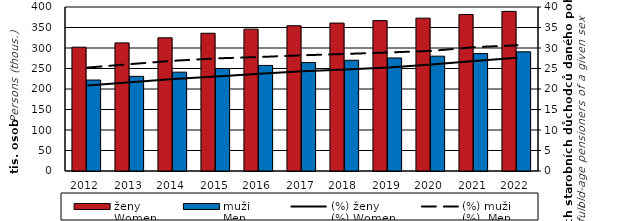
| Category | ženy  
Women | muži  
Men |
|---|---|---|
| 2012.0 | 301986 | 221900 |
| 2013.0 | 312495 | 230861 |
| 2014.0 | 324865 | 241061 |
| 2015.0 | 335915 | 250094 |
| 2016.0 | 346027 | 257474 |
| 2017.0 | 354331 | 264511 |
| 2018.0 | 360801 | 270095 |
| 2019.0 | 366846 | 275790 |
| 2020.0 | 372810 | 280034 |
| 2021.0 | 381636 | 286520 |
| 2022.0 | 389377 | 290753 |